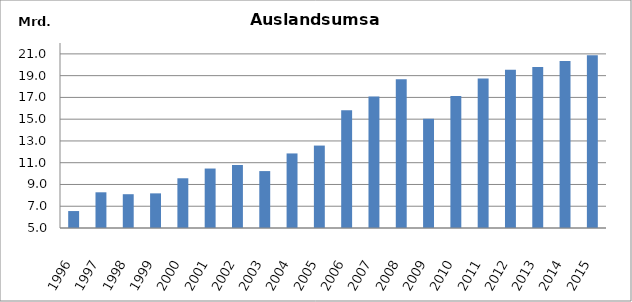
| Category | Series 0 |
|---|---|
| 1996.0 | 6557769 |
| 1997.0 | 8280764 |
| 1998.0 | 8105464 |
| 1999.0 | 8182730 |
| 2000.0 | 9569050 |
| 2001.0 | 10464574 |
| 2002.0 | 10788499 |
| 2003.0 | 10230107 |
| 2004.0 | 11851867 |
| 2005.0 | 12574466 |
| 2006.0 | 15829050 |
| 2007.0 | 17072669 |
| 2008.0 | 18677331 |
| 2009.0 | 15048748 |
| 2010.0 | 17119030.883 |
| 2011.0 | 18748015 |
| 2012.0 | 19537292 |
| 2013.0 | 19797360.276 |
| 2014.0 | 20348090.799 |
| 2015.0 | 20863282 |